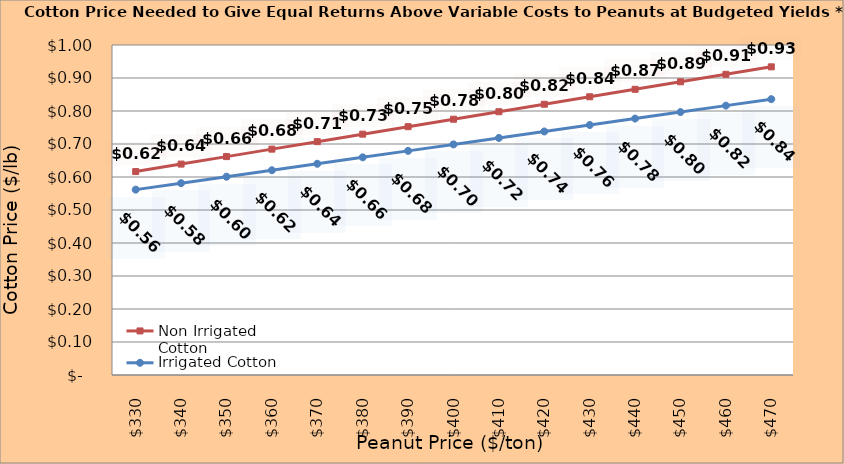
| Category | Non Irrigated Cotton | Irrigated Cotton |
|---|---|---|
| 330.0 | 0.616 | 0.562 |
| 340.0 | 0.639 | 0.581 |
| 350.0 | 0.662 | 0.601 |
| 360.0 | 0.684 | 0.62 |
| 370.0 | 0.707 | 0.64 |
| 380.0 | 0.73 | 0.66 |
| 390.0 | 0.752 | 0.679 |
| 400.0 | 0.775 | 0.699 |
| 410.0 | 0.798 | 0.718 |
| 420.0 | 0.82 | 0.738 |
| 430.0 | 0.843 | 0.758 |
| 440.0 | 0.866 | 0.777 |
| 450.0 | 0.888 | 0.797 |
| 460.0 | 0.911 | 0.816 |
| 470.0 | 0.934 | 0.836 |